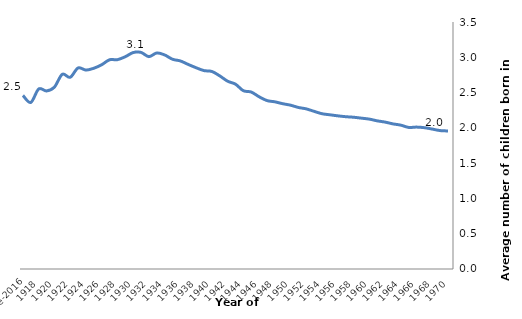
| Category | Series 0 |
|---|---|
| 1970 | 1.956 |
| 1969 | 1.961 |
| 1968 | 1.983 |
| 1967 | 2.002 |
| 1966 | 2.011 |
| 1965 | 2.006 |
| 1964 | 2.038 |
| 1963 | 2.056 |
| 1962 | 2.082 |
| 1961 | 2.099 |
| 1960 | 2.124 |
| 1959 | 2.137 |
| 1958 | 2.15 |
| 1957 | 2.158 |
| 1956 | 2.17 |
| 1955 | 2.185 |
| 1954 | 2.2 |
| 1953 | 2.233 |
| 1952 | 2.269 |
| 1951 | 2.289 |
| 1950 | 2.321 |
| 1949 | 2.342 |
| 1948 | 2.369 |
| 1947 | 2.387 |
| 1946 | 2.44 |
| 1945 | 2.508 |
| 1944 | 2.526 |
| 1943 | 2.619 |
| 1942 | 2.661 |
| 1941 | 2.736 |
| 1940 | 2.799 |
| 1939 | 2.811 |
| 1938 | 2.852 |
| 1937 | 2.898 |
| 1936 | 2.948 |
| 1935 | 2.972 |
| 1934 | 3.033 |
| 1933 | 3.061 |
| 1932 | 3.009 |
| 1931 | 3.069 |
| 1930 | 3.067 |
| 1929 | 3.008 |
| 1928 | 2.966 |
| 1927 | 2.965 |
| 1926 | 2.894 |
| 1925 | 2.845 |
| 1924 | 2.819 |
| 1923 | 2.848 |
| 1922 | 2.717 |
| 1921 | 2.759 |
| 1920 | 2.578 |
| 1919 | 2.523 |
| 1918 | 2.551 |
| 1917 | 2.36 |
| Pre-2016 | 2.46 |